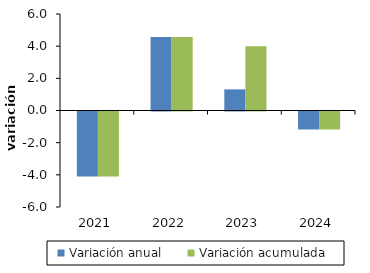
| Category | Variación anual | Variación acumulada |
|---|---|---|
| 2021-01-01 | -4.045 | -4.045 |
| 2022-01-01 | 4.574 | 4.574 |
| 2023-01-01 | 1.314 | 3.991 |
| 2024-01-01 | -1.119 | -1.119 |